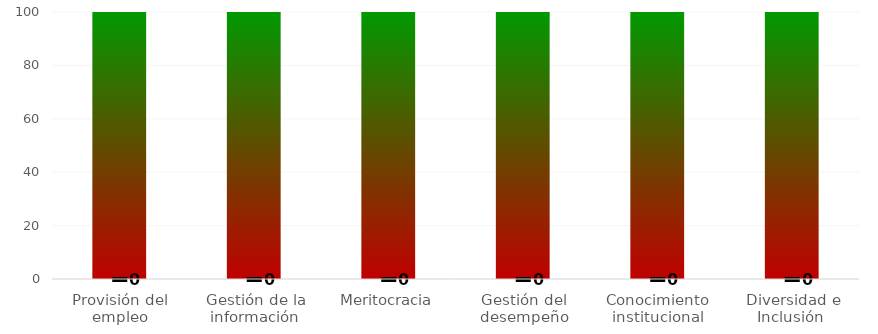
| Category | Niveles |
|---|---|
| Provisión del empleo | 100 |
| Gestión de la información | 100 |
| Meritocracia | 100 |
| Gestión del desempeño | 100 |
| Conocimiento institucional | 100 |
| Diversidad e Inclusión  | 100 |